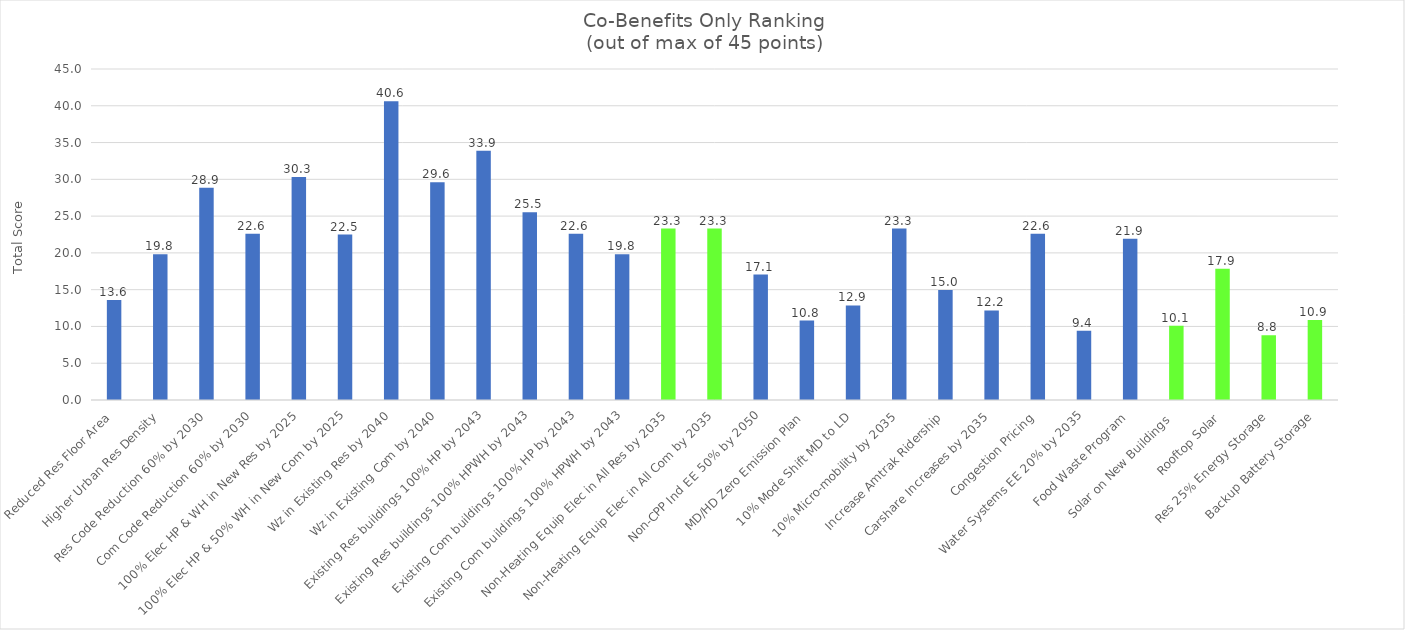
| Category | Series 0 |
|---|---|
| Reduced Res Floor Area | 13.58 |
| Higher Urban Res Density | 19.83 |
| Res Code Reduction 60% by 2030 | 28.87 |
| Com Code Reduction 60% by 2030 | 22.61 |
| 100% Elec HP & WH in New Res by 2025 | 30.31 |
| 100% Elec HP & 50% WH in New Com by 2025 | 22.49 |
| Wz in Existing Res by 2040 | 40.6 |
| Wz in Existing Com by 2040 | 29.59 |
| Existing Res buildings 100% HP by 2043 | 33.88 |
| Existing Res buildings 100% HPWH by 2043 | 25.54 |
| Existing Com buildings 100% HP by 2043 | 22.6 |
| Existing Com buildings 100% HPWH by 2043 | 19.82 |
| Non-Heating Equip Elec in All Res by 2035 | 23.3 |
| Non-Heating Equip Elec in All Com by 2035 | 23.3 |
| Non-CPP Ind EE 50% by 2050 | 17.05 |
| MD/HD Zero Emission Plan | 10.8 |
| 10% Mode Shift MD to LD | 12.86 |
| 10% Micro-mobility by 2035 | 23.3 |
| Increase Amtrak Ridership | 14.96 |
| Carshare Increases by 2035 | 12.18 |
| Congestion Pricing | 22.6 |
| Water Systems EE 20% by 2035 | 9.4 |
| Food Waste Program | 21.91 |
| Solar on New Buildings  | 10.09 |
| Rooftop Solar | 17.85 |
| Res 25% Energy Storage | 8.79 |
| Backup Battery Storage | 10.88 |